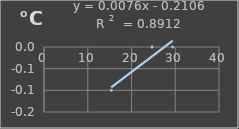
| Category | Temperatura |
|---|---|
| 15.4 | -0.1 |
| 24.7 | 0 |
| 29.4 | 0 |